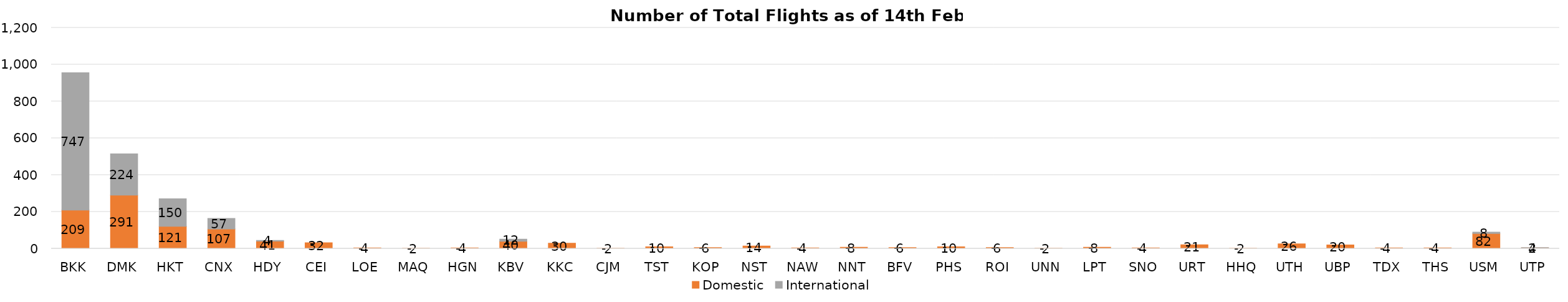
| Category | Domestic | International |
|---|---|---|
| BKK | 209 | 747 |
| DMK | 291 | 224 |
| HKT | 121 | 150 |
| CNX | 107 | 57 |
| HDY | 41 | 4 |
| CEI | 32 | 0 |
| LOE | 4 | 0 |
| MAQ | 2 | 0 |
| HGN | 4 | 0 |
| KBV | 40 | 12 |
| KKC | 30 | 0 |
| CJM | 2 | 0 |
| TST | 10 | 0 |
| KOP | 6 | 0 |
| NST | 14 | 0 |
| NAW | 4 | 0 |
| NNT | 8 | 0 |
| BFV | 6 | 0 |
| PHS | 10 | 0 |
| ROI | 6 | 0 |
| UNN | 2 | 0 |
| LPT | 8 | 0 |
| SNO | 4 | 0 |
| URT | 21 | 0 |
| HHQ | 2 | 0 |
| UTH | 26 | 0 |
| UBP | 20 | 0 |
| TDX | 4 | 0 |
| THS | 4 | 0 |
| USM | 82 | 8 |
| UTP | 4 | 2 |